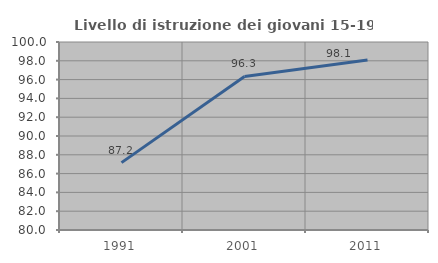
| Category | Livello di istruzione dei giovani 15-19 anni |
|---|---|
| 1991.0 | 87.166 |
| 2001.0 | 96.33 |
| 2011.0 | 98.077 |